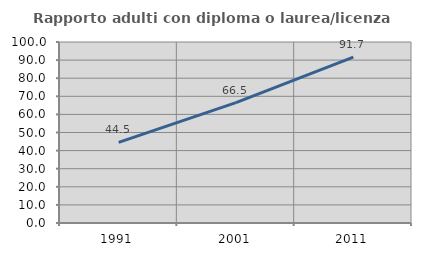
| Category | Rapporto adulti con diploma o laurea/licenza media  |
|---|---|
| 1991.0 | 44.537 |
| 2001.0 | 66.48 |
| 2011.0 | 91.663 |